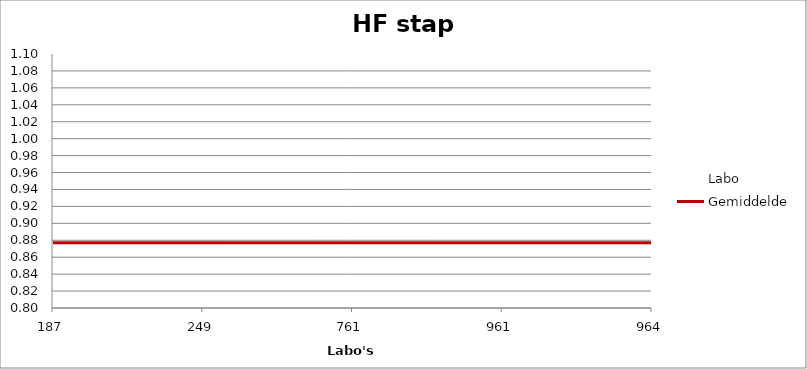
| Category | Labo | Gemiddelde |
|---|---|---|
| 187.0 | 15.769 | 0.877 |
| 249.0 | 0.865 | 0.877 |
| 761.0 | 0.833 | 0.877 |
| 961.0 | 0.936 | 0.877 |
| 964.0 | 0.872 | 0.877 |